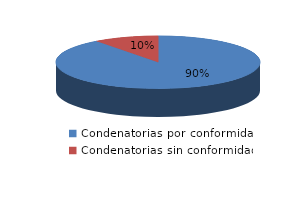
| Category | Series 0 |
|---|---|
| 0 | 35 |
| 1 | 4 |